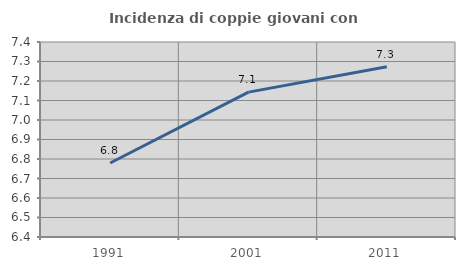
| Category | Incidenza di coppie giovani con figli |
|---|---|
| 1991.0 | 6.78 |
| 2001.0 | 7.143 |
| 2011.0 | 7.273 |